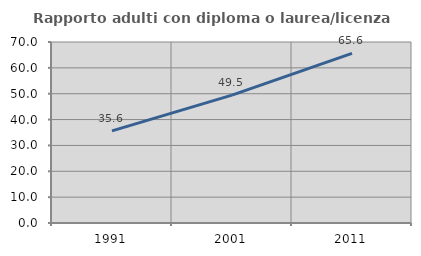
| Category | Rapporto adulti con diploma o laurea/licenza media  |
|---|---|
| 1991.0 | 35.648 |
| 2001.0 | 49.477 |
| 2011.0 | 65.591 |